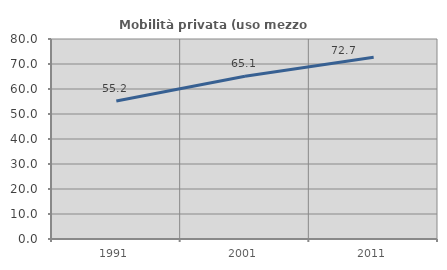
| Category | Mobilità privata (uso mezzo privato) |
|---|---|
| 1991.0 | 55.182 |
| 2001.0 | 65.083 |
| 2011.0 | 72.673 |